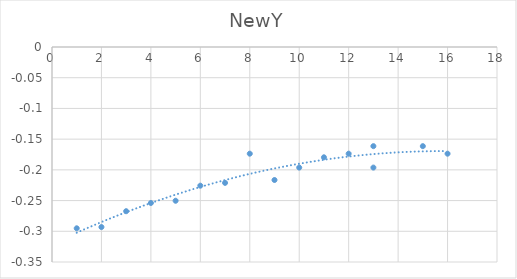
| Category | NewY |
|---|---|
| 1.0 | -0.295 |
| 2.0 | -0.293 |
| 3.0 | -0.267 |
| 4.0 | -0.254 |
| 5.0 | -0.25 |
| 6.0 | -0.226 |
| 7.0 | -0.221 |
| 8.0 | -0.174 |
| 9.0 | -0.217 |
| 10.0 | -0.196 |
| 11.0 | -0.18 |
| 12.0 | -0.174 |
| 13.0 | -0.196 |
| 13.0 | -0.161 |
| 15.0 | -0.161 |
| 16.0 | -0.174 |